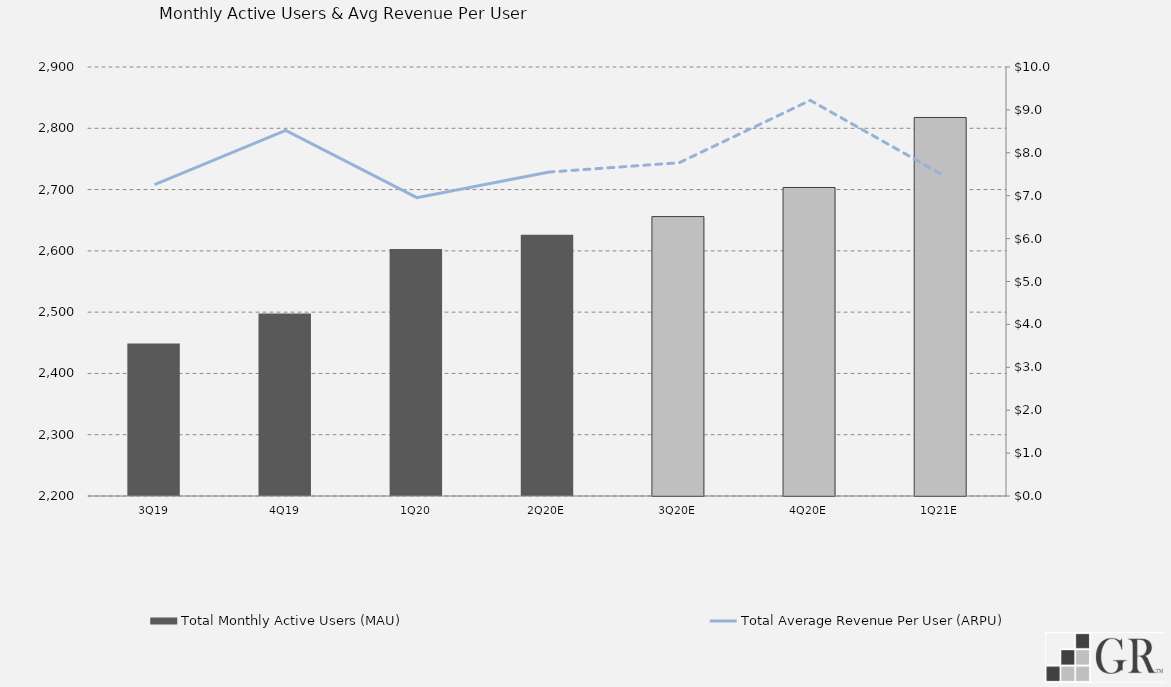
| Category | Total Monthly Active Users (MAU)  |
|---|---|
|  3Q19  | 2449 |
|  4Q19  | 2497.8 |
|  1Q20  | 2603 |
|  2Q20E  | 2626.322 |
|  3Q20E  | 2655.93 |
|  4Q20E  | 2703.382 |
|  1Q21E  | 2817.64 |